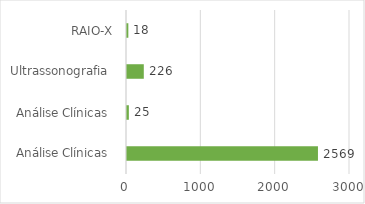
| Category | Series 0 |
|---|---|
| Análise Clínicas  | 2569 |
| Análise Clínicas  | 25 |
| Ultrassonografia  | 226 |
| RAIO-X | 18 |